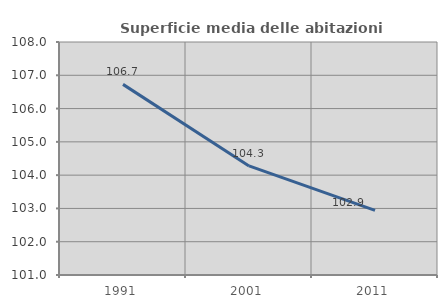
| Category | Superficie media delle abitazioni occupate |
|---|---|
| 1991.0 | 106.727 |
| 2001.0 | 104.277 |
| 2011.0 | 102.942 |